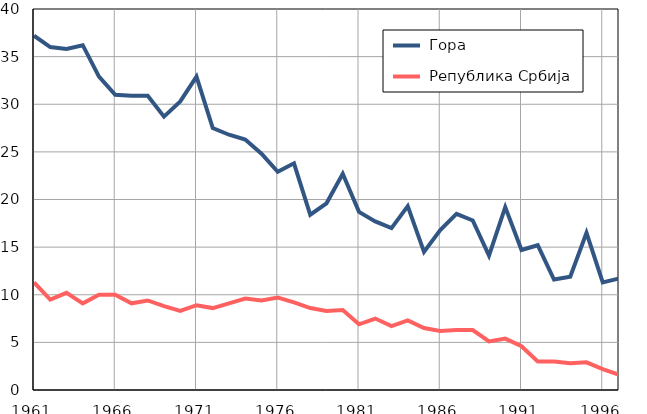
| Category |  Гора |  Република Србија |
|---|---|---|
| 1961.0 | 37.2 | 11.3 |
| 1962.0 | 36 | 9.5 |
| 1963.0 | 35.8 | 10.2 |
| 1964.0 | 36.2 | 9.1 |
| 1965.0 | 32.9 | 10 |
| 1966.0 | 31 | 10 |
| 1967.0 | 30.9 | 9.1 |
| 1968.0 | 30.9 | 9.4 |
| 1969.0 | 28.7 | 8.8 |
| 1970.0 | 30.3 | 8.3 |
| 1971.0 | 32.9 | 8.9 |
| 1972.0 | 27.5 | 8.6 |
| 1973.0 | 26.8 | 9.1 |
| 1974.0 | 26.3 | 9.6 |
| 1975.0 | 24.8 | 9.4 |
| 1976.0 | 22.9 | 9.7 |
| 1977.0 | 23.8 | 9.2 |
| 1978.0 | 18.4 | 8.6 |
| 1979.0 | 19.6 | 8.3 |
| 1980.0 | 22.7 | 8.4 |
| 1981.0 | 18.7 | 6.9 |
| 1982.0 | 17.7 | 7.5 |
| 1983.0 | 17 | 6.7 |
| 1984.0 | 19.3 | 7.3 |
| 1985.0 | 14.5 | 6.5 |
| 1986.0 | 16.8 | 6.2 |
| 1987.0 | 18.5 | 6.3 |
| 1988.0 | 17.8 | 6.3 |
| 1989.0 | 14.1 | 5.1 |
| 1990.0 | 19.2 | 5.4 |
| 1991.0 | 14.7 | 4.6 |
| 1992.0 | 15.2 | 3 |
| 1993.0 | 11.6 | 3 |
| 1994.0 | 11.9 | 2.8 |
| 1995.0 | 16.5 | 2.9 |
| 1996.0 | 11.3 | 2.2 |
| 1997.0 | 11.7 | 1.6 |